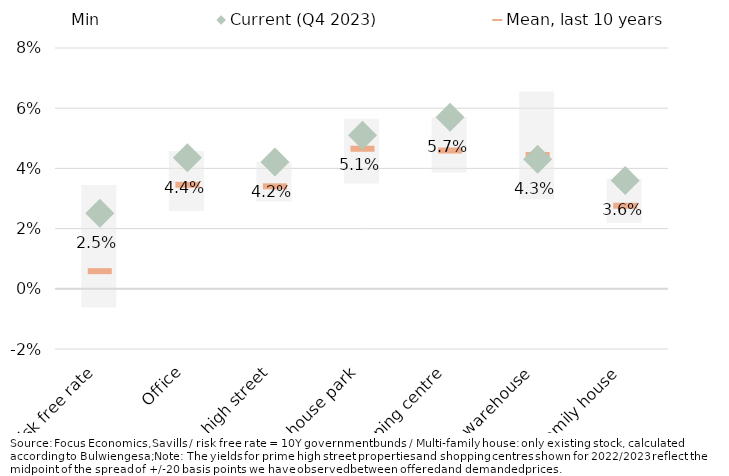
| Category | Min | Range min/max, last 10 years |
|---|---|---|
| Risk free rate | -0.006 | 0.034 |
| Office | 0.026 | 0.02 |
| Prime high street | 0.029 | 0.013 |
| Retail warehouse park | 0.035 | 0.022 |
| Shopping centre | 0.039 | 0.018 |
| Logistics warehouse | 0.03 | 0.036 |
| Multi-family house | 0.022 | 0.015 |